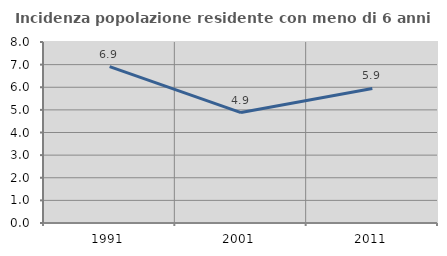
| Category | Incidenza popolazione residente con meno di 6 anni |
|---|---|
| 1991.0 | 6.909 |
| 2001.0 | 4.882 |
| 2011.0 | 5.945 |